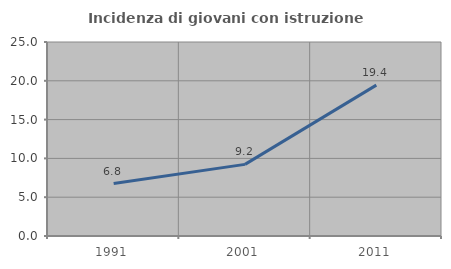
| Category | Incidenza di giovani con istruzione universitaria |
|---|---|
| 1991.0 | 6.757 |
| 2001.0 | 9.231 |
| 2011.0 | 19.444 |